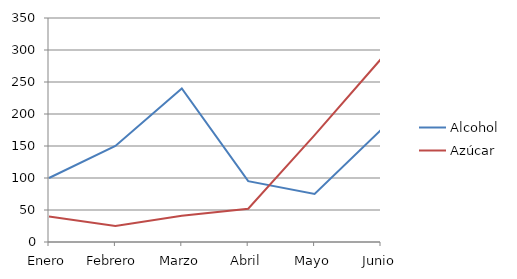
| Category | Alcohol | Azúcar |
|---|---|---|
| Enero | 100 | 40 |
| Febrero | 150 | 25 |
| Marzo | 240 | 41 |
| Abril | 95 | 52 |
| Mayo | 75 | 167 |
| Junio | 175 | 286 |